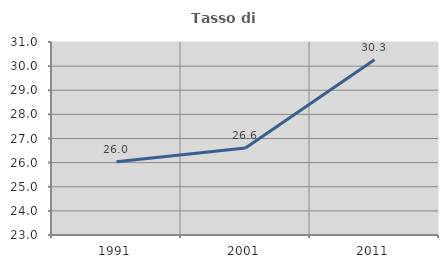
| Category | Tasso di occupazione   |
|---|---|
| 1991.0 | 26.038 |
| 2001.0 | 26.605 |
| 2011.0 | 30.265 |